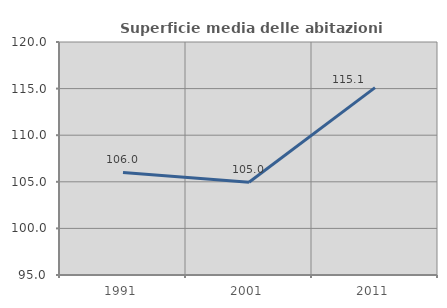
| Category | Superficie media delle abitazioni occupate |
|---|---|
| 1991.0 | 106.006 |
| 2001.0 | 104.956 |
| 2011.0 | 115.103 |